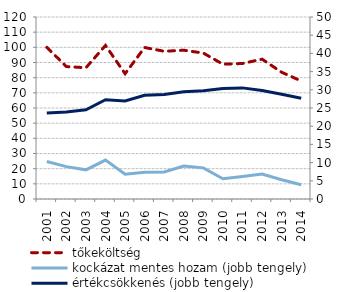
| Category | tőkeköltség |
|---|---|
| 2001.0 | 100 |
| 2002.0 | 87.321 |
| 2003.0 | 86.543 |
| 2004.0 | 101.254 |
| 2005.0 | 82.628 |
| 2006.0 | 99.891 |
| 2007.0 | 97.4 |
| 2008.0 | 98.098 |
| 2009.0 | 96.21 |
| 2010.0 | 88.882 |
| 2011.0 | 89.348 |
| 2012.0 | 92.21 |
| 2013.0 | 83.57 |
| 2014.0 | 77.807 |